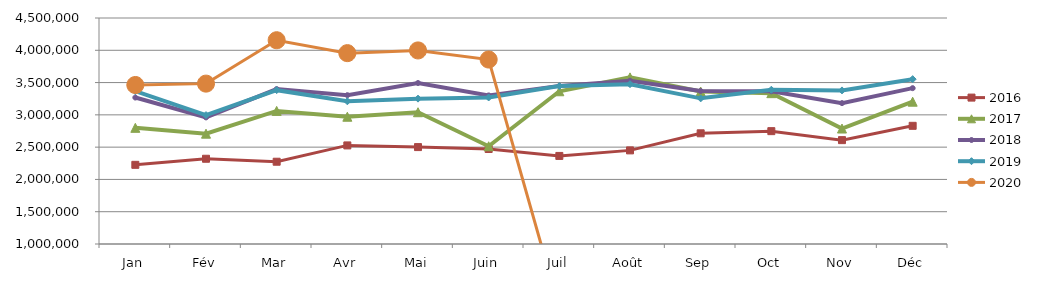
| Category | 2015 | 2016 | 2017 | 2018 | 2019 | 2020 |
|---|---|---|---|---|---|---|
| Jan |  | 2226093.309 | 2798915.391 | 3268127.156 | 3367510.542 | 3462441.736 |
| Fév |  | 2320135.002 | 2708507.11 | 2960518.709 | 2995707.194 | 3483671.962 |
| Mar |  | 2274111.99 | 3061215.361 | 3399788.443 | 3382590.899 | 4155467.912 |
| Avr |  | 2526794.87 | 2970911.094 | 3304906.324 | 3209954.832 | 3955618.656 |
| Mai |  | 2500868.782 | 3040805.262 | 3492911.082 | 3251146.092 | 3997630.17 |
| Juin |  | 2471115.702 | 2513480.318 | 3300924.802 | 3269085.474 | 3856868.196 |
| Juil |  | 2363852.978 | 3365511.031 | 3448603.566 | 3445052.713 | 0 |
| Août |  | 2449927.953 | 3580436.797 | 3528173.012 | 3474993.525 | 0 |
| Sep |  | 2714390.875 | 3361524.335 | 3369626.193 | 3255644.054 | 0 |
| Oct |  | 2747632.929 | 3335934.501 | 3364260.879 | 3388972.2 | 0 |
| Nov |  | 2608583.302 | 2787992.168 | 3181888.576 | 3378477.919 | 0 |
| Déc |  | 2830164.13 | 3203732.398 | 3413454.996 | 3552894.26 | 0 |